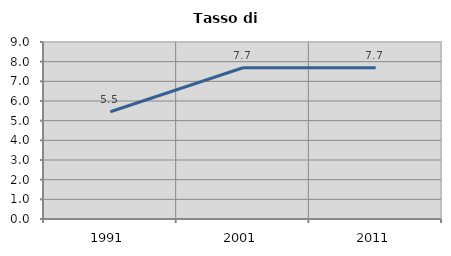
| Category | Tasso di disoccupazione   |
|---|---|
| 1991.0 | 5.455 |
| 2001.0 | 7.692 |
| 2011.0 | 7.692 |